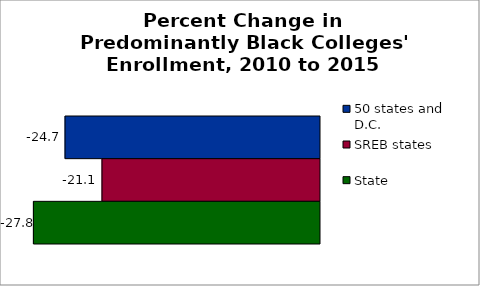
| Category | 50 states and D.C. | SREB states | State |
|---|---|---|---|
| 2011 to 2016 | -24.704 | -21.117 | -27.775 |